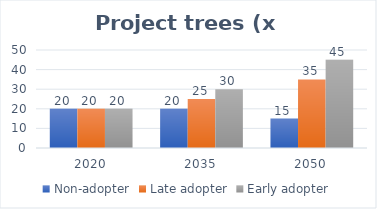
| Category | Non-adopter | Late adopter | Early adopter |
|---|---|---|---|
| 2020.0 | 20 | 20 | 20 |
| 2035.0 | 20 | 25 | 30 |
| 2050.0 | 15 | 35 | 45 |